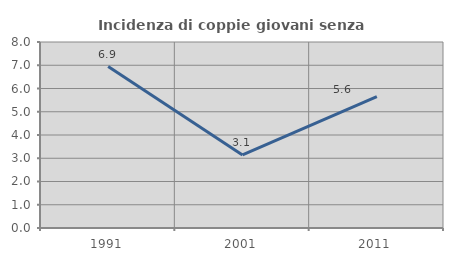
| Category | Incidenza di coppie giovani senza figli |
|---|---|
| 1991.0 | 6.944 |
| 2001.0 | 3.145 |
| 2011.0 | 5.65 |